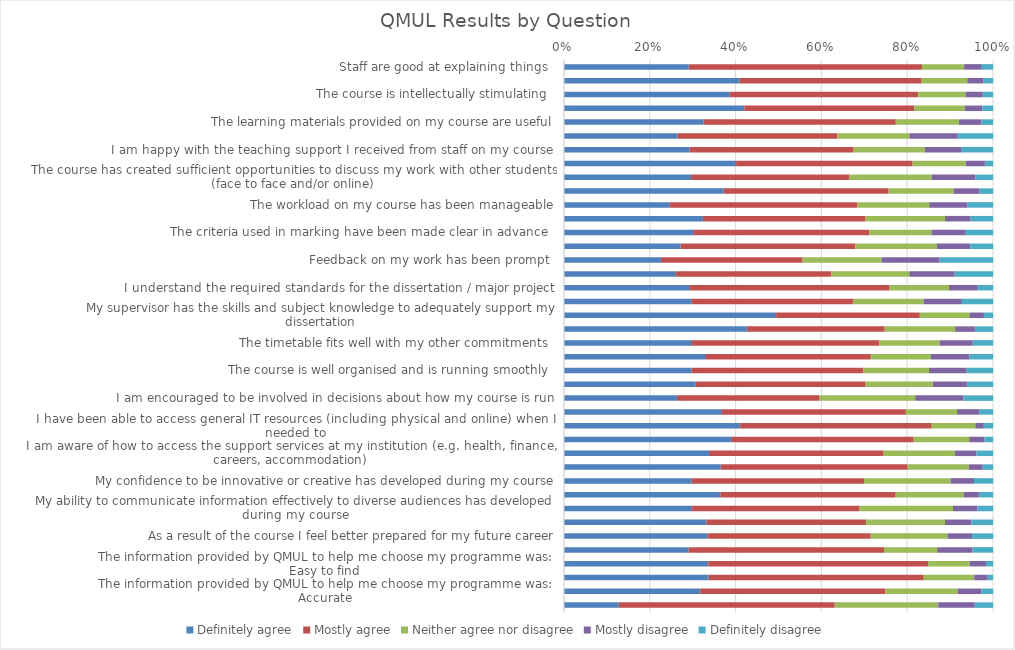
| Category | Definitely agree | Mostly agree | Neither agree nor disagree | Mostly disagree | Definitely disagree |
|---|---|---|---|---|---|
| Staff are good at explaining things
 | 0.291 | 0.544 | 0.098 | 0.041 | 0.026 |
| Staff are enthusiastic about what they are teaching
 | 0.409 | 0.425 | 0.106 | 0.038 | 0.022 |
| The course is intellectually stimulating
 | 0.387 | 0.439 | 0.111 | 0.04 | 0.024 |
| The course has enhanced my academic ability | 0.42 | 0.397 | 0.117 | 0.041 | 0.025 |
| The learning materials provided on my course are useful | 0.326 | 0.448 | 0.147 | 0.053 | 0.027 |
| There is sufficient contact time (face to face and/or virtual/online) between staff and students to support effective learning
 | 0.264 | 0.373 | 0.17 | 0.11 | 0.084 |
| I am happy with the teaching support I received from staff on my course
 | 0.293 | 0.382 | 0.166 | 0.086 | 0.073 |
| I am encouraged to ask questions or make contributions in taught sessions (face to face and/or online) | 0.401 | 0.411 | 0.124 | 0.044 | 0.019 |
| The course has created sufficient opportunities to discuss my work with other students (face to face and/or online) | 0.296 | 0.368 | 0.193 | 0.101 | 0.041 |
| My course has challenged me to produce my best work | 0.372 | 0.385 | 0.151 | 0.059 | 0.033 |
| The workload on my course has been manageable | 0.247 | 0.437 | 0.168 | 0.089 | 0.06 |
| I have appropriate opportunities to give feedback on my experience | 0.324 | 0.378 | 0.186 | 0.06 | 0.052 |
| The criteria used in marking have been made clear in advance
 | 0.301 | 0.411 | 0.146 | 0.077 | 0.065 |
| Assessment arrangements and marking have been fair
 | 0.272 | 0.407 | 0.19 | 0.078 | 0.053 |
| Feedback on my work has been prompt
 | 0.226 | 0.33 | 0.185 | 0.134 | 0.125 |
| Feedback on my work (written or oral) has been useful | 0.261 | 0.362 | 0.182 | 0.106 | 0.089 |
| I understand the required standards for the dissertation / major project | 0.294 | 0.465 | 0.139 | 0.067 | 0.035 |
| I am happy with the support I received for planning my dissertation / major project (topic selection, project outline, literature search, etc) | 0.298 | 0.376 | 0.165 | 0.089 | 0.072 |
| My supervisor has the skills and subject knowledge to adequately support my dissertation
 | 0.494 | 0.335 | 0.116 | 0.034 | 0.021 |
| My supervisor provides helpful feedback on my progress.
 | 0.426 | 0.321 | 0.164 | 0.046 | 0.042 |
| The timetable fits well with my other commitments
 | 0.296 | 0.439 | 0.141 | 0.077 | 0.047 |
| Any changes in the course or teaching have been communicated effectively
 | 0.329 | 0.387 | 0.14 | 0.09 | 0.055 |
| The course is well organised and is running smoothly
 | 0.298 | 0.4 | 0.153 | 0.088 | 0.062 |
| I was given appropriate guidance and support when I started my course | 0.307 | 0.396 | 0.157 | 0.08 | 0.061 |
| I am encouraged to be involved in decisions about how my course is run | 0.263 | 0.333 | 0.223 | 0.113 | 0.069 |
| The library resources and services are good enough for my needs (including physical and online) | 0.368 | 0.429 | 0.119 | 0.051 | 0.032 |
| I have been able to access general IT resources (including physical and online) when I needed to | 0.411 | 0.446 | 0.102 | 0.02 | 0.021 |
| I have been able to access subject specific resources (e.g. equipment, facilities, software) necessary for my studies | 0.391 | 0.424 | 0.129 | 0.035 | 0.02 |
| I am aware of how to access the support services at my institution (e.g. health, finance, careers, accommodation) | 0.338 | 0.407 | 0.166 | 0.05 | 0.039 |
| As a result of the course I am more confident about independent learning
 | 0.365 | 0.436 | 0.142 | 0.033 | 0.024 |
| My confidence to be innovative or creative has developed during my course | 0.298 | 0.402 | 0.202 | 0.054 | 0.044 |
| My research skills have developed during my course | 0.364 | 0.409 | 0.158 | 0.036 | 0.033 |
| My ability to communicate information effectively to diverse audiences has developed during my course | 0.299 | 0.389 | 0.219 | 0.057 | 0.037 |
| I have been encouraged to think about what skills I need to develop for my career | 0.332 | 0.372 | 0.184 | 0.061 | 0.05 |
| As a result of the course I feel better prepared for my future career | 0.335 | 0.38 | 0.18 | 0.057 | 0.049 |
| Overall, I am satisfied with the quality of the course
 | 0.29 | 0.456 | 0.124 | 0.082 | 0.048 |
| The information provided by QMUL to help me choose my programme was:
Easy to find | 0.337 | 0.512 | 0.098 | 0.037 | 0.016 |
| The information provided by QMUL to help me choose my programme was:
Useful | 0.337 | 0.501 | 0.118 | 0.03 | 0.014 |
| The information provided by QMUL to help me choose my programme was:
Accurate | 0.318 | 0.431 | 0.169 | 0.055 | 0.027 |
| To what extent do you agree or disagree that you have received appropriate support for your language needs | 0.128 | 0.504 | 0.241 | 0.085 | 0.043 |